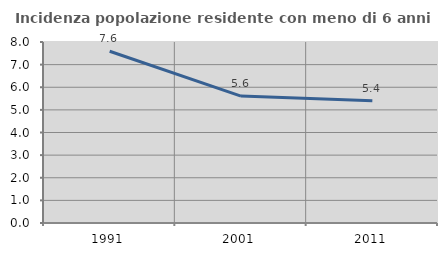
| Category | Incidenza popolazione residente con meno di 6 anni |
|---|---|
| 1991.0 | 7.591 |
| 2001.0 | 5.61 |
| 2011.0 | 5.403 |